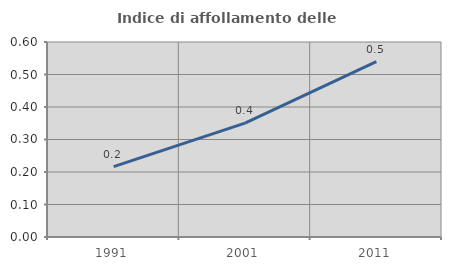
| Category | Indice di affollamento delle abitazioni  |
|---|---|
| 1991.0 | 0.217 |
| 2001.0 | 0.35 |
| 2011.0 | 0.539 |